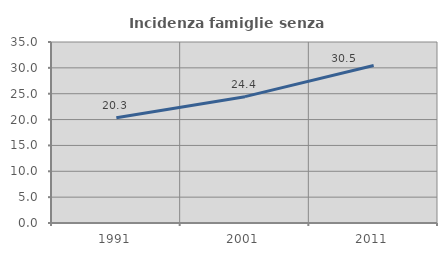
| Category | Incidenza famiglie senza nuclei |
|---|---|
| 1991.0 | 20.338 |
| 2001.0 | 24.43 |
| 2011.0 | 30.452 |